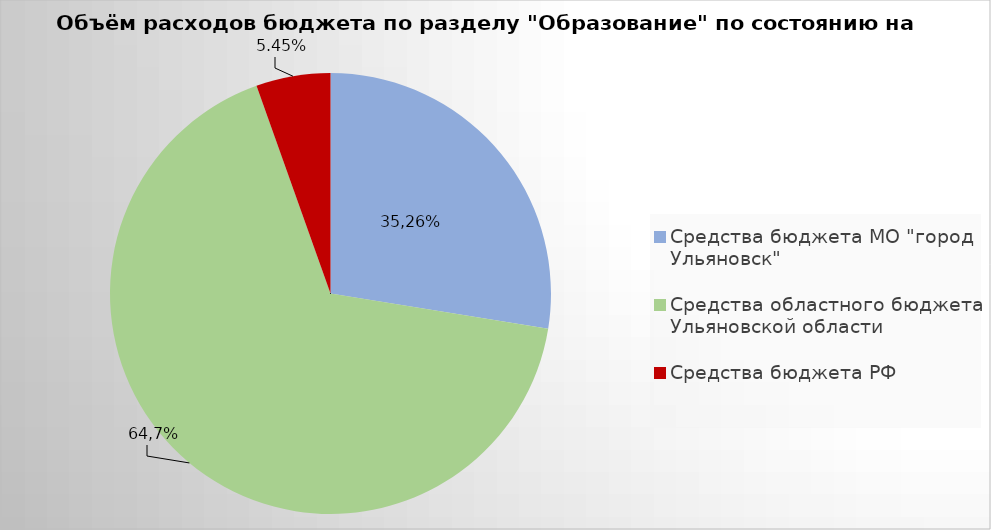
| Category | Series 0 |
|---|---|
| Средства бюджета МО "город Ульяновск" | 2171448.01 |
| Средства областного бюджета Ульяновской области | 5281150.47 |
| Средства бюджета РФ | 429251.77 |